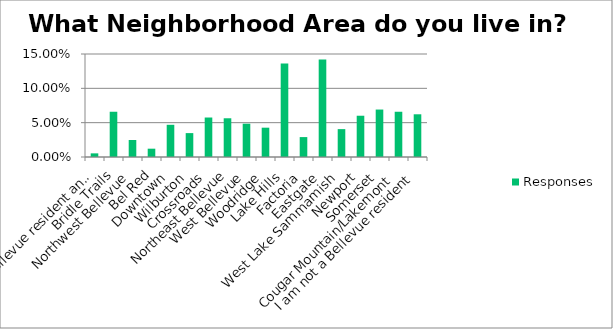
| Category | Responses |
|---|---|
| I am a Bellevue resident and I am currently experiencing homelessness | 0.005 |
| Bridle Trails | 0.066 |
| Northwest Bellevue | 0.025 |
| Bel Red | 0.012 |
| Downtown | 0.047 |
| Wilburton | 0.035 |
| Crossroads | 0.058 |
| Northeast Bellevue | 0.056 |
| West Bellevue | 0.048 |
| Woodridge | 0.043 |
| Lake Hills | 0.136 |
| Factoria | 0.029 |
| Eastgate | 0.142 |
| West Lake Sammamish | 0.041 |
| Newport | 0.06 |
| Somerset | 0.069 |
| Cougar Mountain/Lakemont | 0.066 |
| I am not a Bellevue resident | 0.062 |